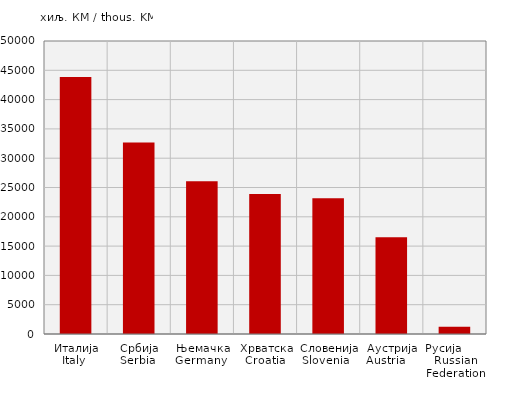
| Category | Извоз
Export |
|---|---|
| Италија
Italy  | 43844.159 |
| Србија
Serbia  | 32677.203 |
| Њемачка
Germany  | 26070.016 |
| Хрватска
Croatia  | 23894.321 |
| Словенија
Slovenia   | 23168.526 |
| Аустрија
Austria     | 16512.459 |
| Русија        Russian Federation | 1234.696 |